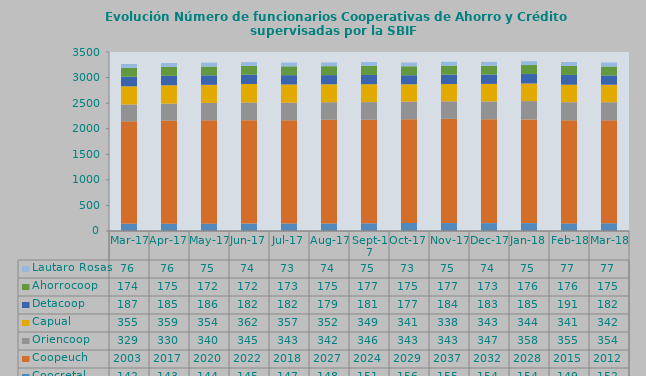
| Category | Coocretal | Coopeuch | Oriencoop | Capual | Detacoop | Ahorrocoop | Lautaro Rosas |
|---|---|---|---|---|---|---|---|
| 2017-03-31 | 142 | 2003 | 329 | 355 | 187 | 174 | 76 |
| 2017-04-30 | 143 | 2017 | 330 | 359 | 185 | 175 | 76 |
| 2017-05-31 | 144 | 2020 | 340 | 354 | 186 | 172 | 75 |
| 2017-06-30 | 145 | 2022 | 345 | 362 | 182 | 172 | 74 |
| 2017-07-31 | 147 | 2018 | 343 | 357 | 182 | 173 | 73 |
| 2017-08-31 | 148 | 2027 | 342 | 352 | 179 | 175 | 74 |
| 2017-09-30 | 151 | 2024 | 346 | 349 | 181 | 177 | 75 |
| 2017-10-31 | 156 | 2029 | 343 | 341 | 177 | 175 | 73 |
| 2017-11-30 | 155 | 2037 | 343 | 338 | 184 | 177 | 75 |
| 2017-12-31 | 154 | 2032 | 347 | 343 | 183 | 173 | 74 |
| 2018-01-31 | 154 | 2028 | 358 | 344 | 185 | 176 | 75 |
| 2018-02-28 | 149 | 2015 | 355 | 341 | 191 | 176 | 77 |
| 2018-03-31 | 152 | 2012 | 354 | 342 | 182 | 175 | 77 |